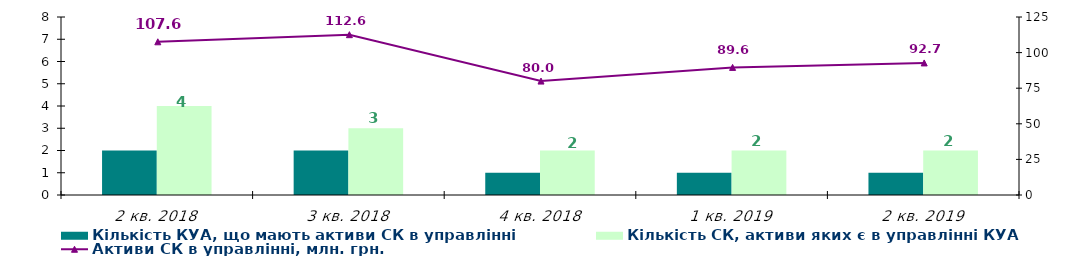
| Category | Кількість КУА, що мають активи СК в управлінні | Кількість СК, активи яких є в управлінні КУА |
|---|---|---|
| 2 кв. 2018 | 2 | 4 |
| 3 кв. 2018 | 2 | 3 |
| 4 кв. 2018 | 1 | 2 |
| 1 кв. 2019 | 1 | 2 |
| 2 кв. 2019 | 1 | 2 |